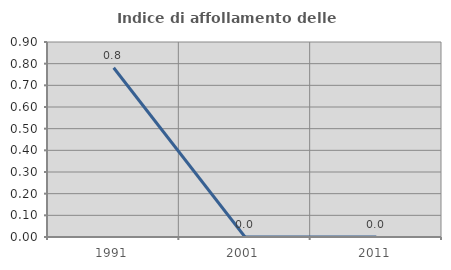
| Category | Indice di affollamento delle abitazioni  |
|---|---|
| 1991.0 | 0.781 |
| 2001.0 | 0 |
| 2011.0 | 0 |